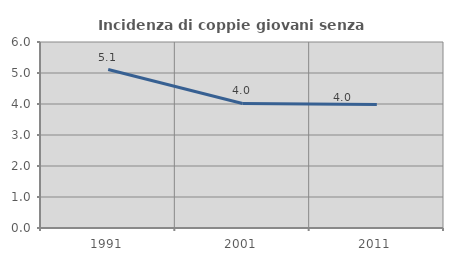
| Category | Incidenza di coppie giovani senza figli |
|---|---|
| 1991.0 | 5.112 |
| 2001.0 | 4.017 |
| 2011.0 | 3.982 |